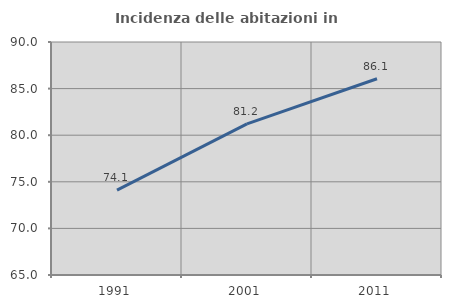
| Category | Incidenza delle abitazioni in proprietà  |
|---|---|
| 1991.0 | 74.105 |
| 2001.0 | 81.209 |
| 2011.0 | 86.057 |